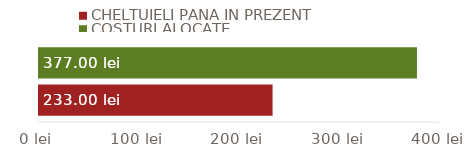
| Category | CHELTUIELI PÂNĂ ÎN PREZENT | COSTURI ALOCATE |
|---|---|---|
| TOTALURI | 233 | 377 |